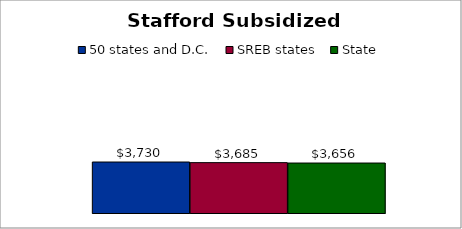
| Category | 50 states and D.C. | SREB states | State |
|---|---|---|---|
| 0 | 3729.632 | 3685.143 | 3655.932 |